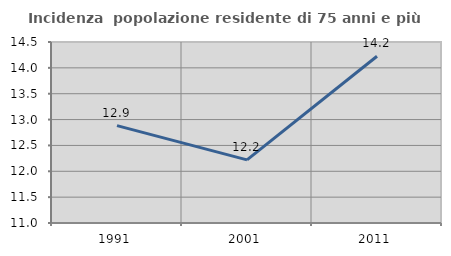
| Category | Incidenza  popolazione residente di 75 anni e più |
|---|---|
| 1991.0 | 12.882 |
| 2001.0 | 12.22 |
| 2011.0 | 14.224 |